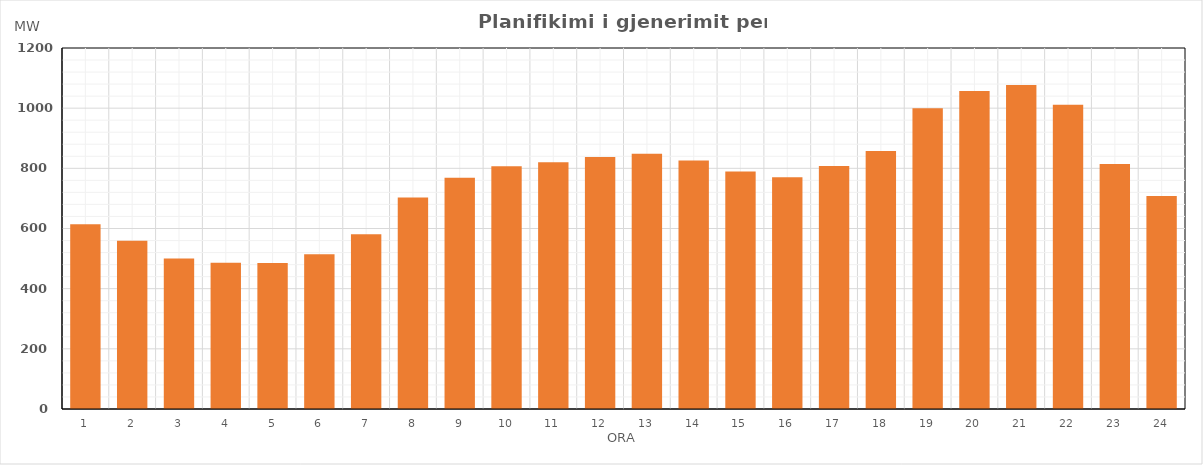
| Category | Max (MW) |
|---|---|
| 0 | 613.77 |
| 1 | 559.65 |
| 2 | 499.93 |
| 3 | 485.94 |
| 4 | 485.51 |
| 5 | 514.6 |
| 6 | 580.77 |
| 7 | 703.25 |
| 8 | 768.84 |
| 9 | 807.27 |
| 10 | 820.45 |
| 11 | 837.7 |
| 12 | 848.58 |
| 13 | 826.32 |
| 14 | 789.51 |
| 15 | 770.64 |
| 16 | 807.63 |
| 17 | 857.6 |
| 18 | 999.78 |
| 19 | 1057.28 |
| 20 | 1077 |
| 21 | 1011.2 |
| 22 | 814.4 |
| 23 | 708.13 |